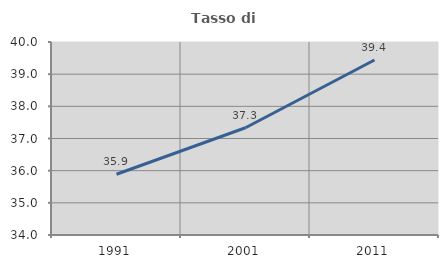
| Category | Tasso di occupazione   |
|---|---|
| 1991.0 | 35.889 |
| 2001.0 | 37.334 |
| 2011.0 | 39.442 |